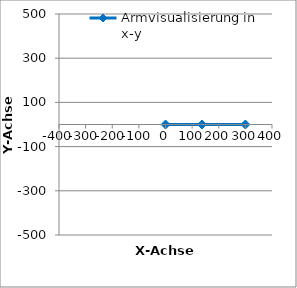
| Category | Armvisualisierung in x-y |
|---|---|
| 0.0 | 0 |
| 136.92178896177327 | 0 |
| 300.0 | 0 |